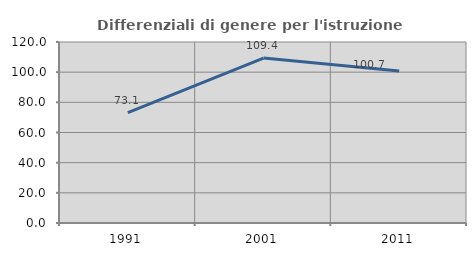
| Category | Differenziali di genere per l'istruzione superiore |
|---|---|
| 1991.0 | 73.114 |
| 2001.0 | 109.357 |
| 2011.0 | 100.708 |